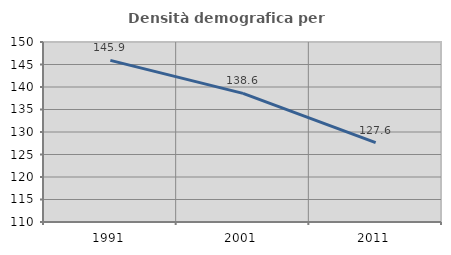
| Category | Densità demografica |
|---|---|
| 1991.0 | 145.916 |
| 2001.0 | 138.58 |
| 2011.0 | 127.643 |